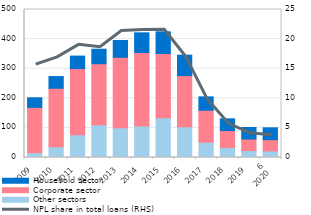
| Category | Other sectors | Corporate sector | Household sector |
|---|---|---|---|
| 2009 | 16.3 | 153.043 | 32.3 |
| 2010 | 36.3 | 197.6 | 39.6 |
| 2011 | 77.1 | 223.3 | 42.2 |
| 2012 | 110.5 | 206.3 | 49 |
| 2013 | 100.2 | 238.4 | 56.7 |
| 2014 | 106.4 | 248.4 | 66.4 |
| 2015 | 134.4 | 216.8 | 73.4 |
| 2016 | 103.8 | 172.8 | 69.2 |
| 2017 | 51.9 | 107.6 | 45.4 |
| 2018 | 34.192 | 56.849 | 39.608 |
| 2019 | 23.45 | 38.949 | 39.017 |
| 6
2020 | 22.095 | 38.183 | 40.051 |